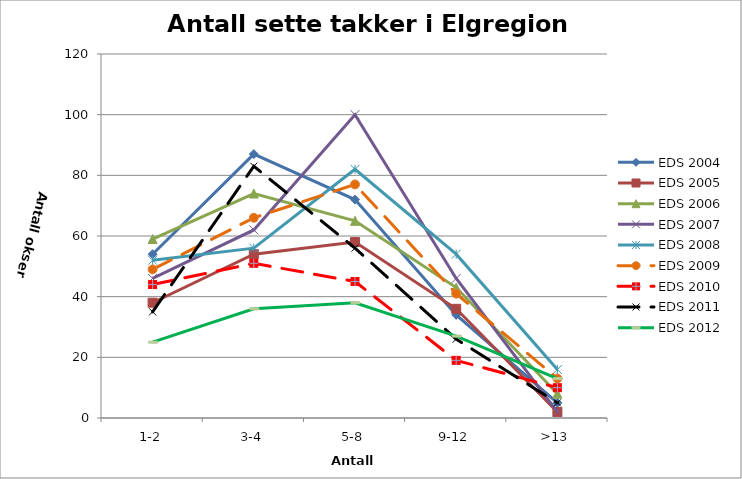
| Category | EDS 2004 | EDS 2005 | EDS 2006 | EDS 2007 | EDS 2008 | EDS 2009 | EDS 2010 | EDS 2011 | EDS 2012 |
|---|---|---|---|---|---|---|---|---|---|
| 1-2 | 54 | 38 | 59 | 46 | 52 | 49 | 44 | 35 | 25 |
| 3-4 | 87 | 54 | 74 | 62 | 56 | 66 | 51 | 83 | 36 |
| 5-8 | 72 | 58 | 65 | 100 | 82 | 77 | 45 | 56 | 38 |
| 9-12 | 34 | 36 | 43 | 46 | 54 | 41 | 19 | 26 | 27 |
| >13 | 5 | 2 | 8 | 2 | 16 | 13 | 10 | 5 | 13 |